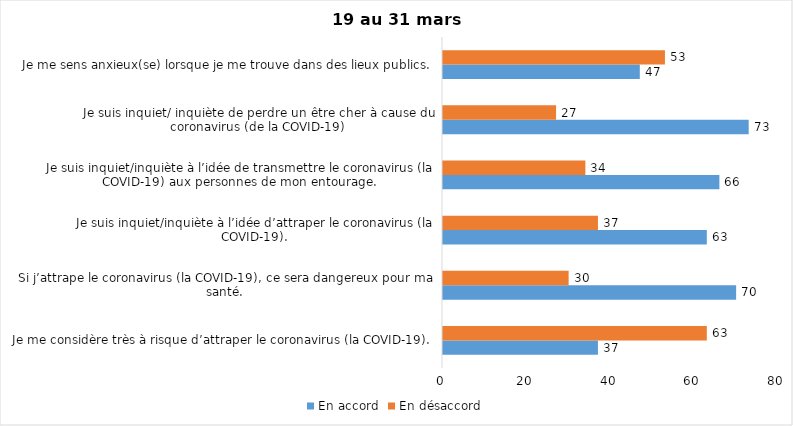
| Category | En accord | En désaccord |
|---|---|---|
| Je me considère très à risque d’attraper le coronavirus (la COVID-19). | 37 | 63 |
| Si j’attrape le coronavirus (la COVID-19), ce sera dangereux pour ma santé. | 70 | 30 |
| Je suis inquiet/inquiète à l’idée d’attraper le coronavirus (la COVID-19). | 63 | 37 |
| Je suis inquiet/inquiète à l’idée de transmettre le coronavirus (la COVID-19) aux personnes de mon entourage. | 66 | 34 |
| Je suis inquiet/ inquiète de perdre un être cher à cause du coronavirus (de la COVID-19) | 73 | 27 |
| Je me sens anxieux(se) lorsque je me trouve dans des lieux publics. | 47 | 53 |